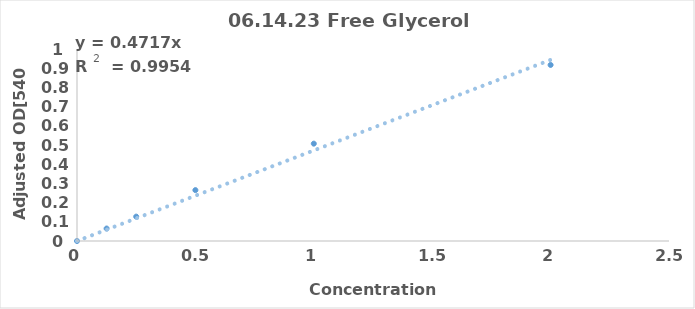
| Category | Series 0 |
|---|---|
| 0.0 | 0 |
| 0.125 | 0.065 |
| 0.25 | 0.127 |
| 0.5 | 0.265 |
| 1.0 | 0.507 |
| 2.0 | 0.917 |